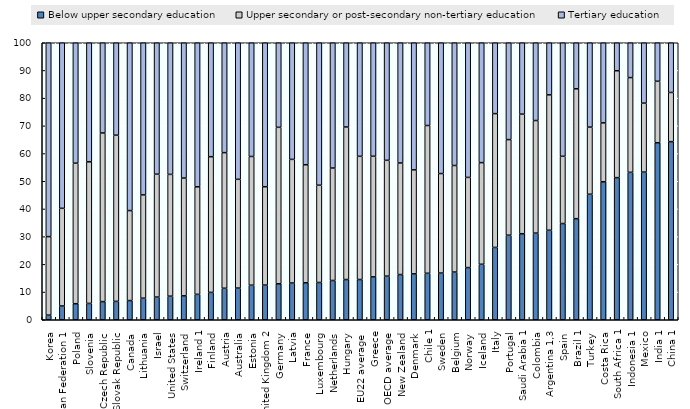
| Category | Below upper secondary education | Upper secondary or post-secondary non-tertiary education | Tertiary education |
|---|---|---|---|
| Korea  | 1.669 | 28.342 | 69.989 |
| Russian Federation 1 | 4.98 | 35.253 | 59.767 |
| Poland  | 5.797 | 50.725 | 43.478 |
| Slovenia  | 5.898 | 51.125 | 42.977 |
| Czech Republic  | 6.555 | 60.881 | 32.564 |
| Slovak Republic  | 6.639 | 59.988 | 33.372 |
| Canada  | 6.926 | 32.491 | 60.583 |
| Lithuania  | 7.783 | 37.291 | 54.926 |
| Israel  | 8.185 | 44.365 | 47.449 |
| United States  | 8.509 | 43.969 | 47.522 |
| Switzerland  | 8.64 | 42.516 | 48.845 |
| Ireland 1 | 9.167 | 38.828 | 52.004 |
| Finland  | 9.884 | 48.983 | 41.134 |
| Austria  | 11.374 | 48.955 | 39.671 |
| Australia  | 11.437 | 39.258 | 49.305 |
| Estonia  | 12.48 | 46.472 | 41.048 |
| United Kingdom 2 | 12.518 | 35.508 | 51.975 |
| Germany  | 12.986 | 56.487 | 30.528 |
| Latvia  | 13.262 | 44.64 | 42.097 |
| France  | 13.345 | 42.618 | 44.037 |
| Luxembourg  | 13.449 | 35.119 | 51.432 |
| Netherlands  | 14.181 | 40.596 | 45.223 |
| Hungary  | 14.524 | 55.076 | 30.4 |
| EU22 average  | 14.526 | 44.48 | 40.994 |
| Greece  | 15.489 | 43.532 | 40.979 |
| OECD average  | 15.75 | 41.81 | 42.945 |
| New Zealand  | 16.32 | 40.284 | 43.396 |
| Denmark  | 16.575 | 37.543 | 45.882 |
| Chile 1 | 16.771 | 53.355 | 29.875 |
| Sweden  | 16.857 | 35.927 | 47.216 |
| Belgium  | 17.225 | 38.464 | 44.311 |
| Norway  | 18.836 | 32.55 | 48.615 |
| Iceland  | 20.033 | 36.696 | 43.271 |
| Italy  | 26.117 | 48.299 | 25.584 |
| Portugal  | 30.518 | 34.518 | 34.964 |
| Saudi Arabia 1 | 31.063 | 43.174 | 25.763 |
| Colombia  | 31.276 | 40.649 | 28.075 |
| Argentina 1,3 | 32.305 | 48.893 | 18.801 |
| Spain  | 34.733 | 24.287 | 40.981 |
| Brazil 1 | 36.494 | 46.878 | 16.628 |
| Turkey  | 45.309 | 24.235 | 30.457 |
| Costa Rica  | 49.803 | 21.274 | 28.923 |
| South Africa 1 | 51.31 | 38.591 | 10.099 |
| Indonesia 1 | 53.221 | 34.202 | 12.577 |
| Mexico  | 53.307 | 24.901 | 21.791 |
| India 1 | 63.914 | 22.186 | 13.9 |
| China 1 | 64.304 | 17.748 | 17.949 |